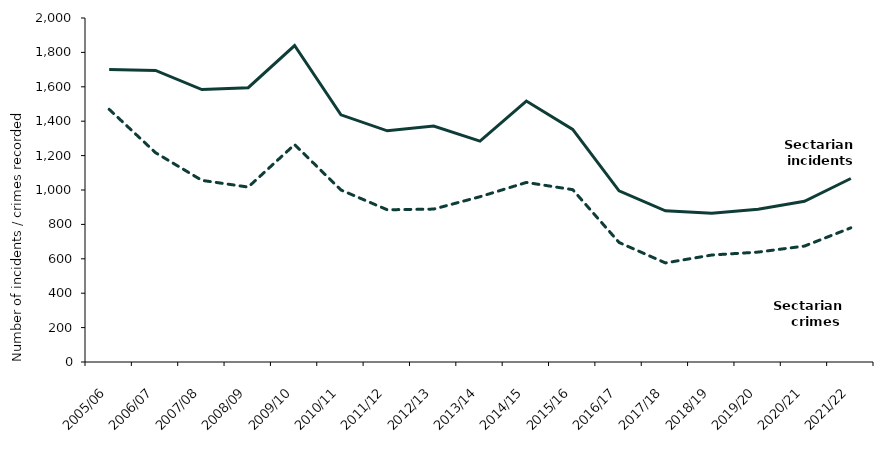
| Category | Sectarian incidents | Sectarian crimes |
|---|---|---|
| 2005/06 | 1701 | 1469 |
| 2006/07 | 1695 | 1217 |
| 2007/08 | 1584 | 1056 |
| 2008/09 | 1595 | 1017 |
| 2009/10 | 1840 | 1264 |
| 2010/11 | 1437 | 1000 |
| 2011/12 | 1344 | 885 |
| 2012/13 | 1372 | 889 |
| 2013/14 | 1284 | 961 |
| 2014/15 | 1517 | 1044 |
| 2015/16 | 1352 | 1002 |
| 2016/17 | 995 | 695 |
| 2017/18 | 879 | 576 |
| 2018/19 | 865 | 622 |
| 2019/20 | 888 | 639 |
| 2020/21 | 934 | 674 |
| 2021/22 | 1067 | 780 |